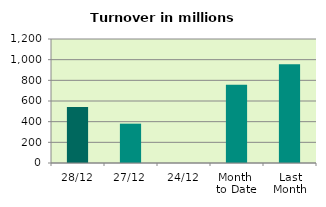
| Category | Series 0 |
|---|---|
| 28/12 | 541.026 |
| 27/12 | 380.68 |
| 24/12 | 0 |
| Month 
to Date | 756.626 |
| Last
Month | 954.978 |